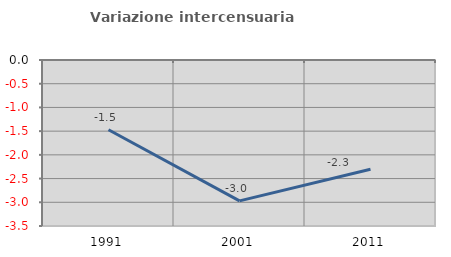
| Category | Variazione intercensuaria annua |
|---|---|
| 1991.0 | -1.471 |
| 2001.0 | -2.971 |
| 2011.0 | -2.305 |